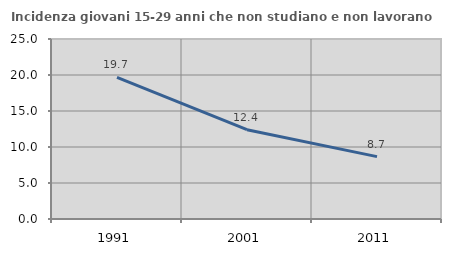
| Category | Incidenza giovani 15-29 anni che non studiano e non lavorano  |
|---|---|
| 1991.0 | 19.685 |
| 2001.0 | 12.403 |
| 2011.0 | 8.661 |